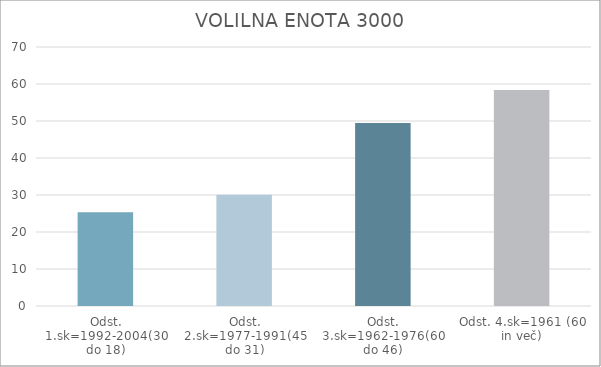
| Category | Series 0 |
|---|---|
| Odst. 1.sk=1992-2004(30 do 18) | 25.35 |
| Odst. 2.sk=1977-1991(45 do 31) | 30.05 |
| Odst. 3.sk=1962-1976(60 do 46) | 49.49 |
| Odst. 4.sk=1961 (60 in več) | 58.4 |